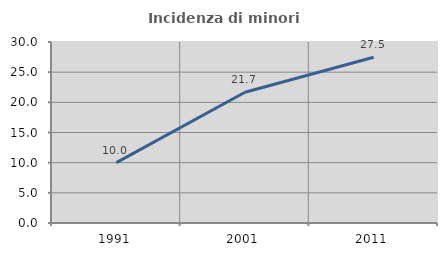
| Category | Incidenza di minori stranieri |
|---|---|
| 1991.0 | 10 |
| 2001.0 | 21.667 |
| 2011.0 | 27.481 |